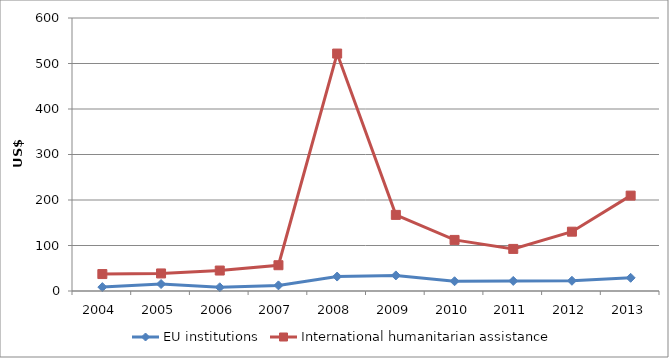
| Category | EU institutions | International humanitarian assistance |
|---|---|---|
| 2004.0 | 8.56 | 37.226 |
| 2005.0 | 15.35 | 38.583 |
| 2006.0 | 8.18 | 44.965 |
| 2007.0 | 12.34 | 56.638 |
| 2008.0 | 31.76 | 521.808 |
| 2009.0 | 34.27 | 167.291 |
| 2010.0 | 21.43 | 112.286 |
| 2011.0 | 22.12 | 92.499 |
| 2012.0 | 22.49 | 130.371 |
| 2013.0 | 28.978 | 209.637 |